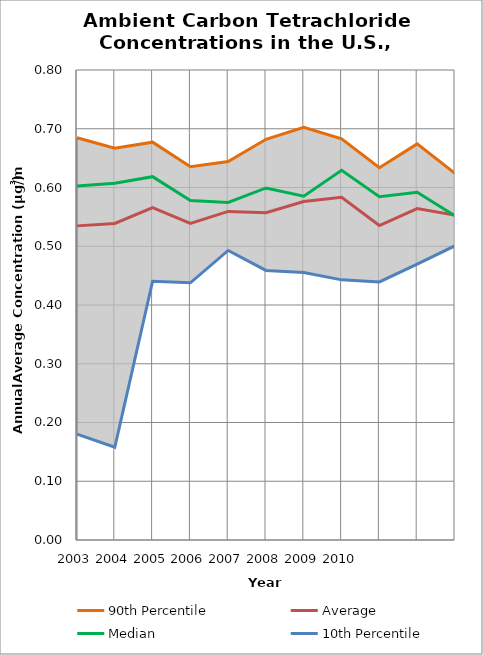
| Category | 90th Percentile | Average | Median | 10th Percentile |
|---|---|---|---|---|
| 2003.0 | 0.685 | 0.535 | 0.602 | 0.18 |
| 2004.0 | 0.667 | 0.539 | 0.607 | 0.158 |
| 2005.0 | 0.677 | 0.566 | 0.618 | 0.44 |
| 2006.0 | 0.635 | 0.539 | 0.578 | 0.438 |
| 2007.0 | 0.644 | 0.559 | 0.575 | 0.493 |
| 2008.0 | 0.682 | 0.557 | 0.599 | 0.459 |
| 2009.0 | 0.703 | 0.576 | 0.585 | 0.455 |
| 2010.0 | 0.683 | 0.583 | 0.629 | 0.443 |
| 2011.0 | 0.634 | 0.535 | 0.584 | 0.439 |
| 2012.0 | 0.674 | 0.564 | 0.592 | 0.47 |
| 2013.0 | 0.624 | 0.553 | 0.552 | 0.501 |